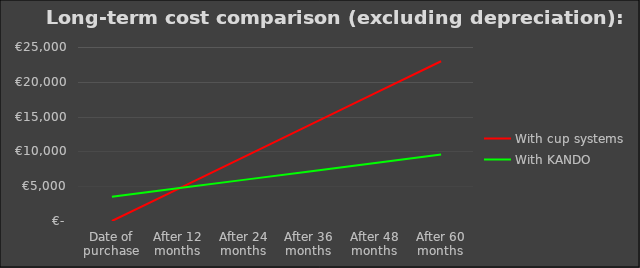
| Category | With cup systems | With KANDO |
|---|---|---|
| Date of purchase | 0 | 3475 |
| After 12 months | 4590 | 4691.5 |
| After 24 months | 9180 | 5908 |
| After 36 months | 13770 | 7124.5 |
| After 48 months | 18360 | 8341 |
| After 60 months | 22950 | 9557.5 |